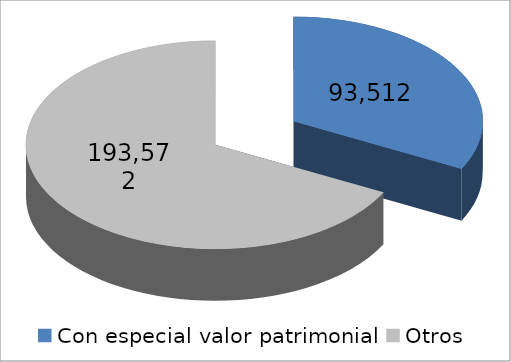
| Category | Series 0 |
|---|---|
| Con especial valor patrimonial | 93512 |
| Otros | 193572 |